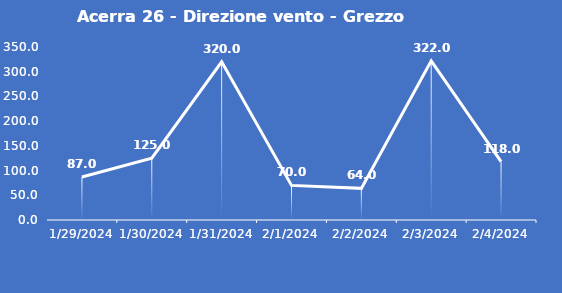
| Category | Acerra 26 - Direzione vento - Grezzo (°N) |
|---|---|
| 1/29/24 | 87 |
| 1/30/24 | 125 |
| 1/31/24 | 320 |
| 2/1/24 | 70 |
| 2/2/24 | 64 |
| 2/3/24 | 322 |
| 2/4/24 | 118 |